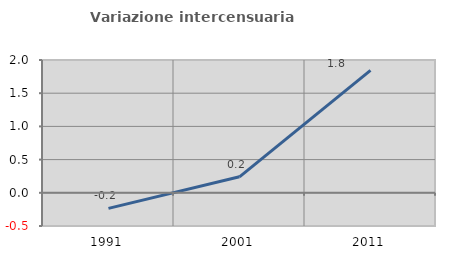
| Category | Variazione intercensuaria annua |
|---|---|
| 1991.0 | -0.234 |
| 2001.0 | 0.241 |
| 2011.0 | 1.844 |